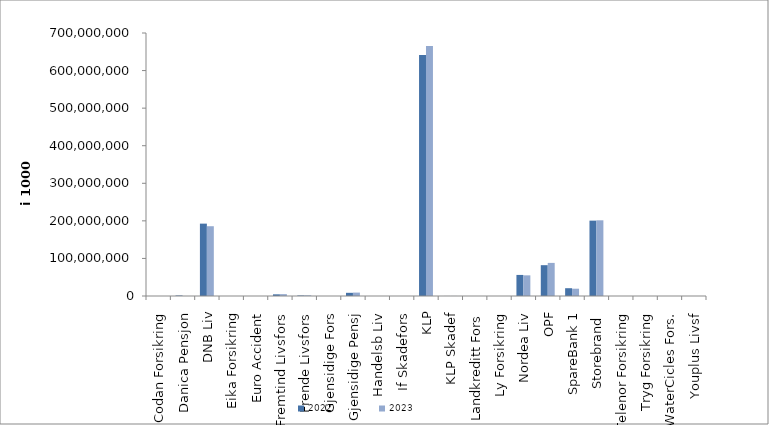
| Category | 2022 | 2023 |
|---|---|---|
| Codan Forsikring | 0 | 0 |
| Danica Pensjon | 1381543.839 | 0 |
| DNB Liv | 192614629.342 | 185707519.945 |
| Eika Forsikring | 0 | 0 |
| Euro Accident | 0 | 0 |
| Fremtind Livsfors | 4438692.953 | 4951045.908 |
| Frende Livsfors | 1439347 | 1734604 |
| Gjensidige Fors | 0 | 0 |
| Gjensidige Pensj | 8469814 | 9094615 |
| Handelsb Liv | 22760.624 | 0 |
| If Skadefors | 0 | 0 |
| KLP | 641185711.485 | 665564510.556 |
| KLP Skadef | 84130.567 | 114338.397 |
| Landkreditt Fors | 0 | 0 |
| Ly Forsikring | 0 | 0 |
| Nordea Liv | 56075290 | 54987610 |
| OPF | 82039593 | 88090907 |
| SpareBank 1 | 20731745.617 | 19424412.877 |
| Storebrand  | 200579203.156 | 201474818.165 |
| Telenor Forsikring | 0 | 0 |
| Tryg Forsikring | 0 | 0 |
| WaterCicles Fors. | 0 | 0 |
| Youplus Livsf | 837 | 7107 |